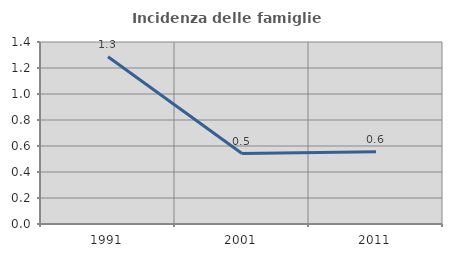
| Category | Incidenza delle famiglie numerose |
|---|---|
| 1991.0 | 1.286 |
| 2001.0 | 0.542 |
| 2011.0 | 0.556 |